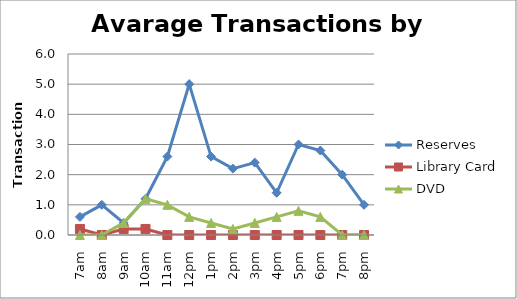
| Category | Reserves | Library Card | DVD |
|---|---|---|---|
| 7am | 0.6 | 0.2 | 0 |
| 8am | 1 | 0 | 0 |
| 9am | 0.4 | 0.2 | 0.4 |
| 10am | 1.2 | 0.2 | 1.2 |
| 11am | 2.6 | 0 | 1 |
| 12pm | 5 | 0 | 0.6 |
| 1pm | 2.6 | 0 | 0.4 |
| 2pm | 2.2 | 0 | 0.2 |
| 3pm | 2.4 | 0 | 0.4 |
| 4pm | 1.4 | 0 | 0.6 |
| 5pm | 3 | 0 | 0.8 |
| 6pm | 2.8 | 0 | 0.6 |
| 7pm | 2 | 0 | 0 |
| 8pm | 1 | 0 | 0 |